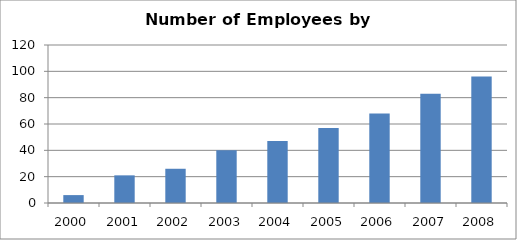
| Category | Series 0 |
|---|---|
| 2000.0 | 6 |
| 2001.0 | 21 |
| 2002.0 | 26 |
| 2003.0 | 40 |
| 2004.0 | 47 |
| 2005.0 | 57 |
| 2006.0 | 68 |
| 2007.0 | 83 |
| 2008.0 | 96 |